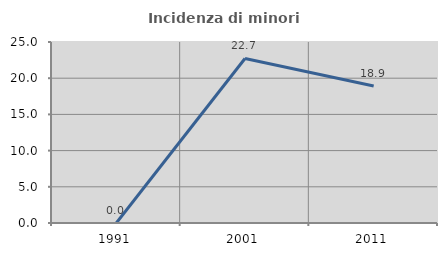
| Category | Incidenza di minori stranieri |
|---|---|
| 1991.0 | 0 |
| 2001.0 | 22.727 |
| 2011.0 | 18.919 |